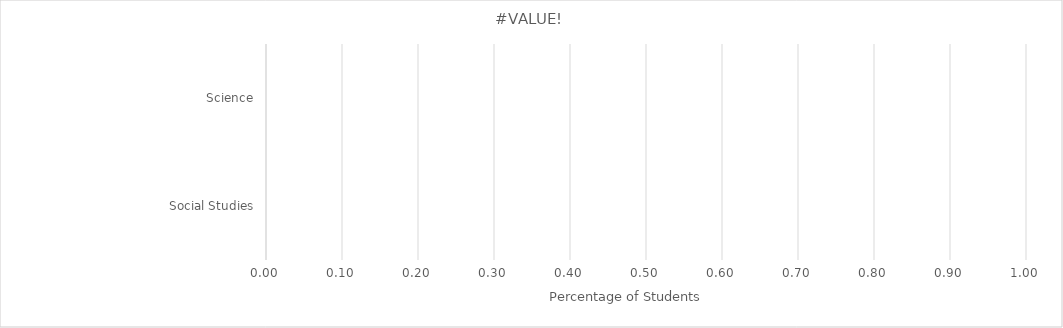
| Category | Benchmark | Entire LEA  | Title IV-A Identified Schools |
|---|---|---|---|
| Science | 0 | 0 | 0 |
| Social Studies | 0 | 0 | 0 |